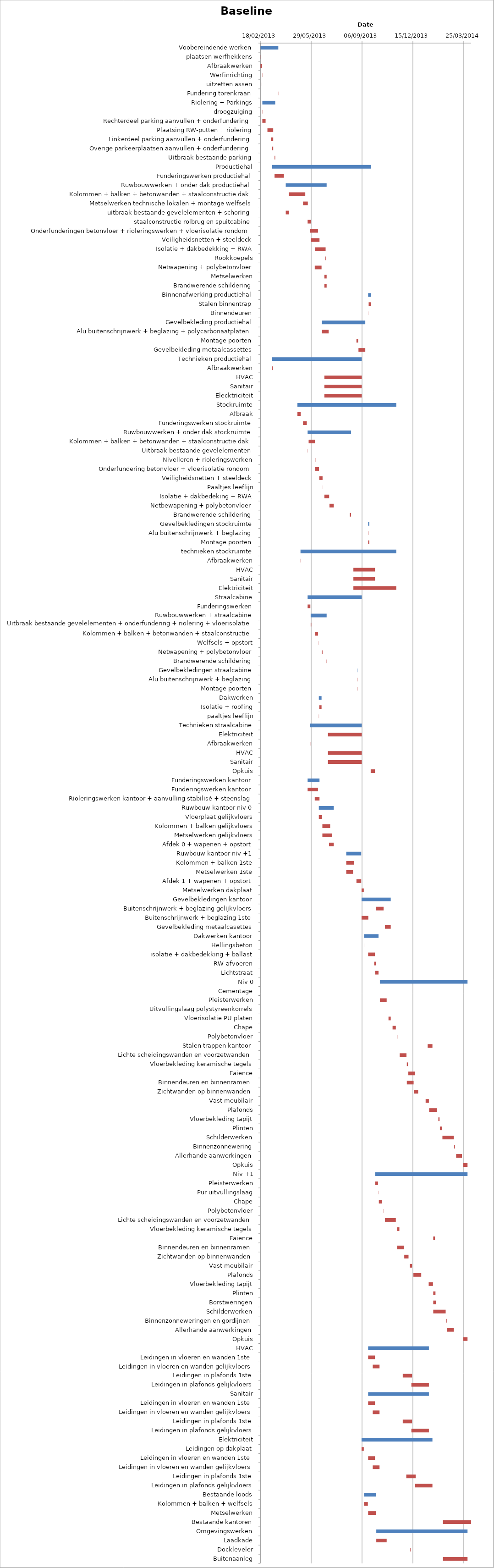
| Category | Baseline start | Actual duration |
|---|---|---|
| Voobereindende werken | 41323.333 | 35.375 |
| plaatsen werfhekkens | 41323.333 | 0.375 |
| Afbraakwerken | 41323.333 | 3.375 |
| Werfinrichting | 41327.333 | 0.375 |
| uitzetten assen | 41326.333 | 0.375 |
| Fundering torenkraan | 41358.333 | 0.375 |
| Riolering + Parkings | 41327.333 | 25.375 |
| droogzuiging | 41327.333 | 0.375 |
| Rechterdeel parking aanvullen + onderfundering | 41327.333 | 6.375 |
| Plaatsing RW-putten + riolering | 41337.333 | 11.375 |
| Linkerdeel parking aanvullen + onderfundering | 41344.333 | 4.375 |
| Overige parkeerplaatsen aanvullen + onderfundering | 41346.333 | 2.375 |
| Uitbraak bestaande parking | 41351.333 | 1.375 |
| Productiehal | 41346.333 | 194.375 |
| Funderingswerken productiehal | 41351.333 | 18.375 |
| Ruwbouwwerken + onder dak productiehal | 41373.333 | 80.375 |
| Kolommen + balken + betonwanden + staalconstructie dak | 41379.333 | 32.375 |
| Metselwerken technische lokalen + montage welfsels | 41407.333 | 9.375 |
| uitbraak bestaande gevelelementen + schoring | 41373.333 | 6.375 |
| staalconstructie rolbrug en spuitcabine | 41416.333 | 6.375 |
| Onderfunderingen betonvloer + rioleringswerken + vloerisolatie rondom | 41421.333 | 15.375 |
| Veiligheidsnetten + steeldeck | 41423.333 | 16.375 |
| Isolatie + dakbedekking + RWA | 41431.333 | 20.375 |
| Rookkoepels | 41451.333 | 1.375 |
| Netwapening + polybetonvloer | 41430.333 | 13.375 |
| Metselwerken | 41449.333 | 4.375 |
| Brandwerende schildering | 41449.333 | 4.375 |
| Binnenafwerking productiehal | 41535.333 | 5.375 |
| Stalen binnentrap | 41536.333 | 4.375 |
| Binnendeuren | 41535.333 | 0.375 |
| Gevelbekleding productiehal | 41444.333 | 85.375 |
| Alu buitenschrijnwerk + beglazing + polycarbonaatplaten | 41444.333 | 13.375 |
| Montage poorten | 41512.333 | 3.375 |
| Gevelbekleding metaalcassettes | 41516.333 | 13.375 |
| Technieken productiehal | 41346.333 | 176.375 |
| Afbraakwerken | 41346.333 | 1.375 |
| HVAC | 41449.333 | 73.375 |
| Sanitair | 41449.333 | 73.375 |
| Elecktriciteit | 41449.333 | 73.375 |
| Stockruimte | 41396.333 | 194.375 |
| Afbraak | 41396.333 | 6.375 |
| Funderingswerken stockruimte | 41407.333 | 7.375 |
| Ruwbouwwerken + onder dak stockruimte | 41416.333 | 85.375 |
| Kolommen + balken + betonwanden + staalconstructie dak | 41418.333 | 12.375 |
| Uitbraak bestaande gevelelementen | 41416.333 | 0.375 |
| Nivelleren + rioleringswerken | 41431.333 | 0.375 |
| Onderfundering betonvloer + vloerisolatie rondom | 41431.333 | 7.375 |
| Veiligheidsnetten + steeldeck | 41439.333 | 6.375 |
| Paaltjes leeflijn | 41446.333 | 0.375 |
| Isolatie + dakbedeking + RWA | 41449.333 | 9.375 |
| Netbewapening + polybetonvloer | 41459.333 | 8.375 |
| Brandwerende schildering | 41499.333 | 2.375 |
| Gevelbekledingen stockruimte | 41535.333 | 2.375 |
| Alu buitenschrijnwerk + beglazing | 41536.333 | 0.375 |
| Montage poorten | 41535.333 | 2.375 |
| technieken stockruimte | 41402.333 | 188.375 |
| Afbraakwerken | 41402.333 | 0.375 |
| HVAC | 41506.333 | 42.375 |
| Sanitair | 41506.333 | 42.375 |
| Elektriciteit | 41506.333 | 84.375 |
| Straalcabine | 41416.333 | 106.375 |
| Funderingswerken | 41416.333 | 5.375 |
| Ruwbouwwerken + straalcabine | 41422.333 | 31.375 |
| Uitbraak bestaande gevelelementen + onderfundering + riolering + vloerisolatie rondom | 41422.333 | 1.375 |
| Kolommen + balken + betonwanden + staalconstructie | 41431.333 | 5.375 |
| Welfsels + opstort | 41437.333 | 0.375 |
| Netwapening + polybetonvloer | 41444.333 | 1.375 |
| Brandwerende schildering | 41453.333 | 0.375 |
| Gevelbekledingen straalcabine | 41514.333 | 0.375 |
| Alu buitenschrijnwerk + beglazing | 41514.333 | 0.375 |
| Montage poorten | 41514.333 | 0.375 |
| Dakwerken | 41438.333 | 5.375 |
| Isolatie + roofing | 41439.333 | 4.375 |
| paaltjes leeflijn | 41438.333 | 0.375 |
| Technieken straalcabine | 41421.333 | 101.375 |
| Elektriciteit | 41456.333 | 66.375 |
| Afbraakwerken | 41421.333 | 0.375 |
| HVAC | 41456.333 | 66.375 |
| Sanitair | 41456.333 | 66.375 |
| Opkuis | 41540.333 | 8.375 |
| Funderingswerken kantoor | 41416.333 | 23.375 |
| Funderingswerken kantoor | 41416.333 | 20.375 |
| Rioleringswerken kantoor + aanvulling stabilisé + steenslag | 41430.333 | 9.375 |
| Ruwbouw kantoor niv 0 | 41438.333 | 29.375 |
| Vloerplaat gelijkvloers | 41438.333 | 6.375 |
| Kolommen + balken gelijkvloers | 41445.333 | 15.375 |
| Metselwerken gelijkvloers | 41445.333 | 19.375 |
| Afdek 0 + wapenen + opstort | 41458.333 | 9.375 |
| Ruwbouw kantoor niv +1 | 41492.333 | 29.375 |
| Kolommen + balken 1ste | 41492.333 | 15.375 |
| Metselwerken 1ste | 41492.333 | 13.375 |
| Afdek 1 + wapenen + opstort | 41512.333 | 9.375 |
| Metselwerken dakplaat | 41522.333 | 4.375 |
| Gevelbekledingen kantoor | 41522.333 | 57.375 |
| Buitenschrijnwerk + beglazing gelijkvloers | 41550.333 | 15.375 |
| Buitenschrijnwerk + beglazing 1ste | 41522.333 | 13.375 |
| Gevelbekleding metaalcasettes | 41568.333 | 11.375 |
| Dakwerken kantoor | 41527.333 | 28.375 |
| Hellingsbeton | 41527.333 | 0.375 |
| isolatie + dakbedekking + ballast | 41535.333 | 13.375 |
| RW-afvoeren | 41547.333 | 3.375 |
| Lichtstraat | 41549.333 | 6.375 |
| Niv 0 | 41558.333 | 172.375 |
| Cementage | 41572.333 | 0.375 |
| Pleisterwerken | 41558.333 | 13.375 |
| Uitvullingslaag polystyreenkorrels | 41572.333 | 0.375 |
| Vloerisolatie PU platen | 41575.333 | 4.375 |
| Chape | 41583.333 | 6.375 |
| Polybetonvloer | 41593.333 | 0.375 |
| Stalen trappen kantoor | 41652.333 | 9.375 |
| Lichte scheidingswanden en voorzetwanden | 41597.333 | 13.375 |
| Vloerbekleding keramische tegels | 41611.333 | 2.375 |
| Faience | 41614.333 | 13.375 |
| Binnendeuren en binnenramen | 41611.333 | 13.375 |
| Zichtwanden op binnenwanden | 41625.333 | 8.375 |
| Vast meubilair | 41648.333 | 6.375 |
| Plafonds | 41655.333 | 15.375 |
| Vloerbekleding tapijt | 41673.333 | 2.375 |
| Plinten | 41676.333 | 4.375 |
| Schilderwerken | 41681.333 | 22.375 |
| Binnenzonnewering | 41704.333 | 1.375 |
| Allerhande aanwerkingen | 41708.333 | 11.375 |
| Opkuis | 41722.333 | 8.375 |
| Niv +1 | 41549.333 | 181.375 |
| Pleisterwerken | 41549.333 | 5.375 |
| Pur uitvullingslaag | 41555.333 | 0.375 |
| Chape | 41556.333 | 6.375 |
| Polybetonvloer | 41565.333 | 0.375 |
| Lichte scheidingswanden en voorzetwanden | 41568.333 | 21.375 |
| Vloerbekleding keramische tegels | 41592.333 | 4.375 |
| Faience | 41663.333 | 3.375 |
| Binnendeuren en binnenramen | 41592.333 | 13.375 |
| Zichtwanden op binnenwanden | 41606.333 | 8.375 |
| Vast meubilair | 41617.333 | 4.375 |
| Plafonds | 41624.333 | 15.375 |
| Vloerbekleding tapijt | 41654.333 | 8.375 |
| Plinten | 41663.333 | 4.375 |
| Borstweringen | 41663.333 | 5.375 |
| Schilderwerken | 41663.333 | 24.375 |
| Binnenzonneweringen en gordijnen | 41688.333 | 1.375 |
| Allerhande aanwerkingen | 41690.333 | 13.375 |
| Opkuis | 41722.333 | 8.375 |
| HVAC | 41535.333 | 119.375 |
| Leidingen in vloeren en wanden 1ste | 41535.333 | 13.375 |
| Leidingen in vloeren en wanden gelijkvloers | 41544.333 | 13.375 |
| Leidingen in plafonds 1ste | 41603.333 | 18.375 |
| Leidingen in plafonds gelijkvloers | 41620.333 | 34.375 |
| Sanitair | 41535.333 | 119.375 |
| Leidingen in vloeren en wanden 1ste | 41535.333 | 13.375 |
| Leidingen in vloeren en wanden gelijkvloers | 41544.333 | 13.375 |
| Leidingen in plafonds 1ste | 41603.333 | 18.375 |
| Leidingen in plafonds gelijkvloers | 41620.333 | 34.375 |
| Elektriciteit | 41522.333 | 139.375 |
| Leidingen op dakplaat | 41522.333 | 4.375 |
| Leidingen in vloeren en wanden 1ste | 41535.333 | 13.375 |
| Leidingen in vloeren en wanden gelijkvloers | 41544.333 | 13.375 |
| Leidingen in plafonds 1ste | 41610.333 | 18.375 |
| Leidingen in plafonds gelijkvloers | 41627.333 | 34.375 |
| Bestaande loods | 41527.333 | 23.375 |
| Kolommen + balken + welfsels | 41527.333 | 7.375 |
| Metselwerken | 41535.333 | 15.375 |
| Bestaande kantoren | 41682.333 | 55.375 |
| Omgevingswerken | 41551.333 | 179.375 |
| Laadkade | 41551.333 | 20.375 |
| Dockleveler | 41618.333 | 1.375 |
| Buitenaanleg | 41682.333 | 48.375 |